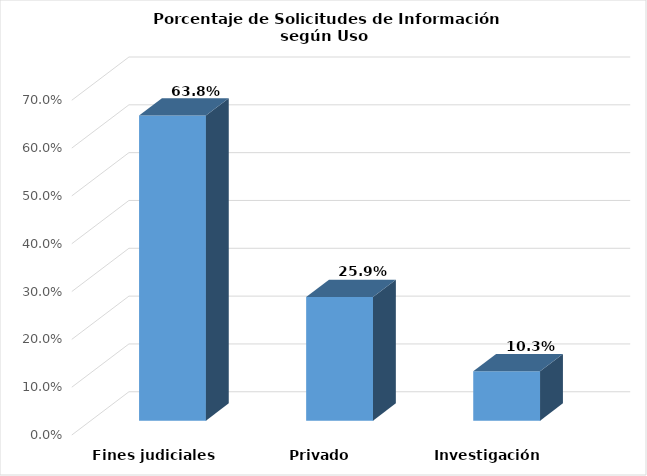
| Category | Series 0 |
|---|---|
| Fines judiciales | 0.638 |
| Privado | 0.259 |
| Investigación | 0.103 |